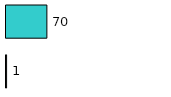
| Category | Series 0 | Series 1 |
|---|---|---|
| 0 | 1 | 70 |